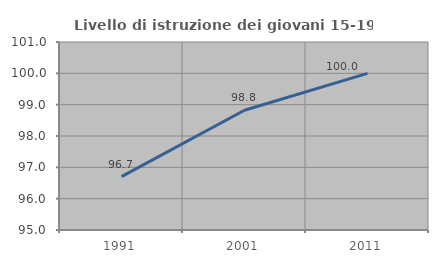
| Category | Livello di istruzione dei giovani 15-19 anni |
|---|---|
| 1991.0 | 96.703 |
| 2001.0 | 98.824 |
| 2011.0 | 100 |